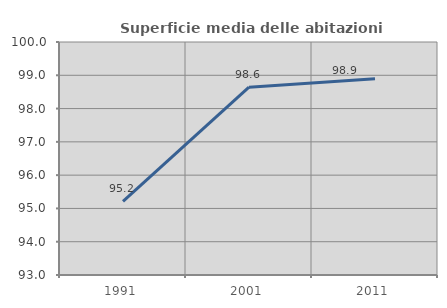
| Category | Superficie media delle abitazioni occupate |
|---|---|
| 1991.0 | 95.215 |
| 2001.0 | 98.643 |
| 2011.0 | 98.893 |